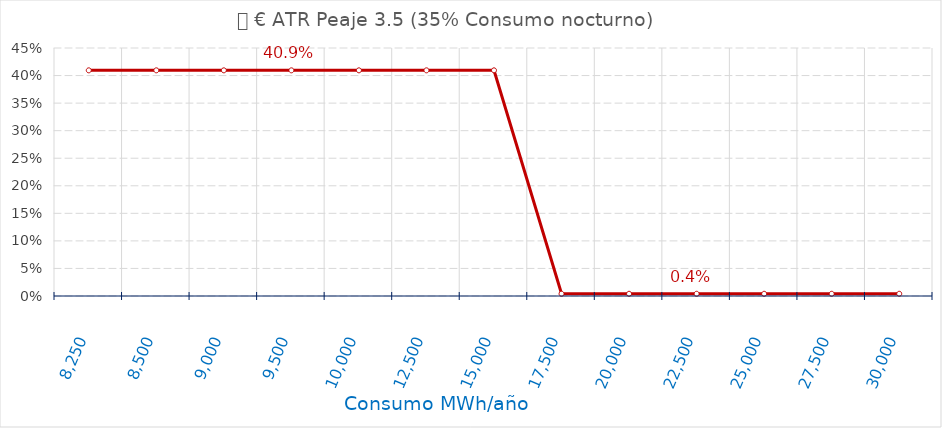
| Category | D €/año |
|---|---|
| 8250.0 | 0.409 |
| 8500.0 | 0.409 |
| 9000.0 | 0.409 |
| 9500.0 | 0.409 |
| 10000.0 | 0.409 |
| 12500.0 | 0.409 |
| 15000.0 | 0.409 |
| 17500.0 | 0.004 |
| 20000.0 | 0.004 |
| 22500.0 | 0.004 |
| 25000.0 | 0.004 |
| 27500.0 | 0.004 |
| 30000.0 | 0.004 |